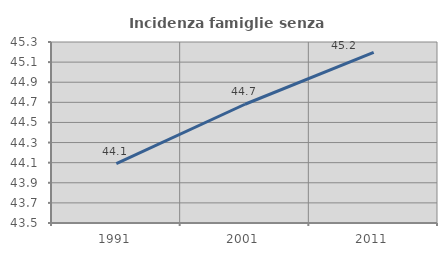
| Category | Incidenza famiglie senza nuclei |
|---|---|
| 1991.0 | 44.089 |
| 2001.0 | 44.681 |
| 2011.0 | 45.198 |